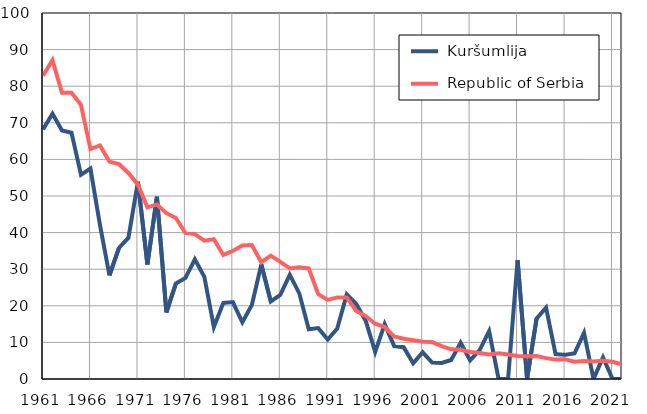
| Category |  Kuršumlija |  Republic of Serbia |
|---|---|---|
| 1961.0 | 68.2 | 82.9 |
| 1962.0 | 72.5 | 87.1 |
| 1963.0 | 67.9 | 78.2 |
| 1964.0 | 67.3 | 78.2 |
| 1965.0 | 55.8 | 74.9 |
| 1966.0 | 57.5 | 62.8 |
| 1967.0 | 42.1 | 63.8 |
| 1968.0 | 28.3 | 59.4 |
| 1969.0 | 35.8 | 58.7 |
| 1970.0 | 38.6 | 56.3 |
| 1971.0 | 53.9 | 53.1 |
| 1972.0 | 31.3 | 46.9 |
| 1973.0 | 49.8 | 47.7 |
| 1974.0 | 18.2 | 45.3 |
| 1975.0 | 26.1 | 44 |
| 1976.0 | 27.6 | 39.9 |
| 1977.0 | 32.7 | 39.6 |
| 1978.0 | 27.9 | 37.8 |
| 1979.0 | 14.2 | 38.2 |
| 1980.0 | 20.8 | 33.9 |
| 1981.0 | 21 | 35 |
| 1982.0 | 15.5 | 36.5 |
| 1983.0 | 20.2 | 36.6 |
| 1984.0 | 31.3 | 31.9 |
| 1985.0 | 21.2 | 33.7 |
| 1986.0 | 23 | 32 |
| 1987.0 | 28.5 | 30.2 |
| 1988.0 | 23.4 | 30.5 |
| 1989.0 | 13.6 | 30.2 |
| 1990.0 | 13.9 | 23.2 |
| 1991.0 | 10.8 | 21.6 |
| 1992.0 | 13.8 | 22.3 |
| 1993.0 | 23.1 | 22.3 |
| 1994.0 | 20.5 | 18.6 |
| 1995.0 | 15.9 | 17.2 |
| 1996.0 | 7.4 | 15.1 |
| 1997.0 | 15 | 14.2 |
| 1998.0 | 9 | 11.6 |
| 1999.0 | 8.7 | 11 |
| 2000.0 | 4.3 | 10.6 |
| 2001.0 | 7.3 | 10.2 |
| 2002.0 | 4.5 | 10.1 |
| 2003.0 | 4.4 | 9 |
| 2004.0 | 5.2 | 8.1 |
| 2005.0 | 9.9 | 8 |
| 2006.0 | 5.1 | 7.4 |
| 2007.0 | 7.9 | 7.1 |
| 2008.0 | 13.1 | 6.7 |
| 2009.0 | 0 | 7 |
| 2010.0 | 0 | 6.7 |
| 2011.0 | 32.5 | 6.3 |
| 2012.0 | 0 | 6.2 |
| 2013.0 | 16.5 | 6.3 |
| 2014.0 | 19.5 | 5.7 |
| 2015.0 | 6.8 | 5.3 |
| 2016.0 | 6.6 | 5.4 |
| 2017.0 | 7 | 4.7 |
| 2018.0 | 12.6 | 4.9 |
| 2019.0 | 0 | 4.8 |
| 2020.0 | 5.9 | 5 |
| 2021.0 | 0 | 4.7 |
| 2022.0 | 0 | 4 |